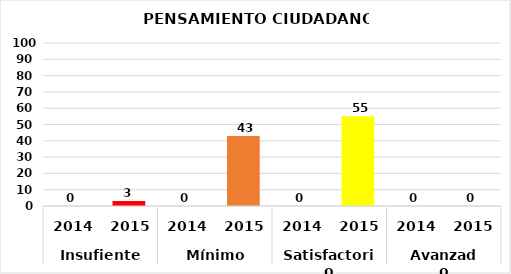
| Category | Series 0 |
|---|---|
| 0 | 0 |
| 1 | 3 |
| 2 | 0 |
| 3 | 43 |
| 4 | 0 |
| 5 | 55 |
| 6 | 0 |
| 7 | 0 |